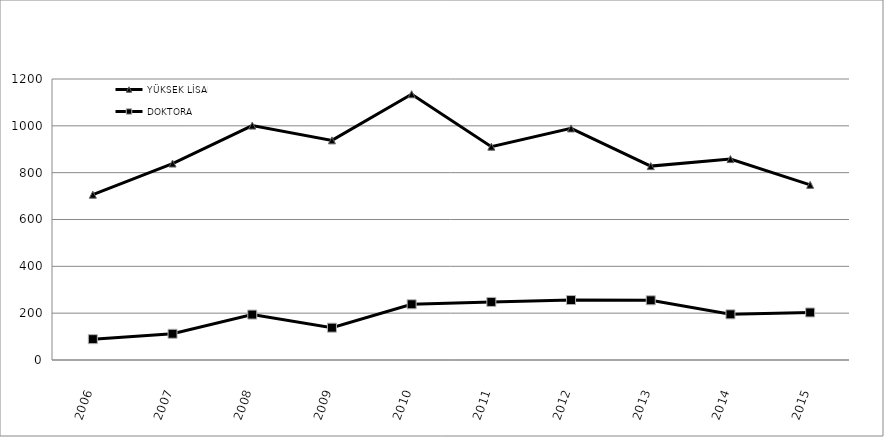
| Category | YÜKSEK LİSANS | DOKTORA |
|---|---|---|
| 2006.0 | 706 | 89 |
| 2007.0 | 839 | 112 |
| 2008.0 | 1001 | 194 |
| 2009.0 | 938 | 138 |
| 2010.0 | 1135 | 238 |
| 2011.0 | 911 | 248 |
| 2012.0 | 989 | 256 |
| 2013.0 | 828 | 255 |
| 2014.0 | 858 | 195 |
| 2015.0 | 748 | 203 |